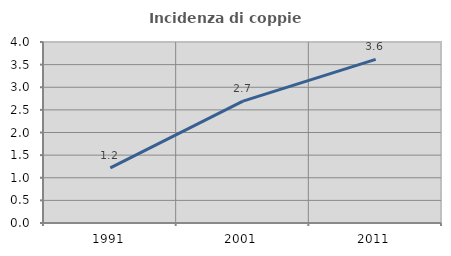
| Category | Incidenza di coppie miste |
|---|---|
| 1991.0 | 1.22 |
| 2001.0 | 2.694 |
| 2011.0 | 3.617 |